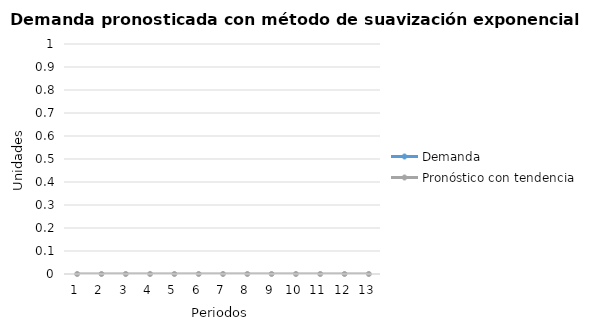
| Category | Demanda | Pronóstico con tendencia |
|---|---|---|
| 0 |  | 0 |
| 1 |  | 0 |
| 2 |  | 0 |
| 3 |  | 0 |
| 4 |  | 0 |
| 5 |  | 0 |
| 6 |  | 0 |
| 7 |  | 0 |
| 8 |  | 0 |
| 9 |  | 0 |
| 10 |  | 0 |
| 11 |  | 0 |
| 12 |  | 0 |